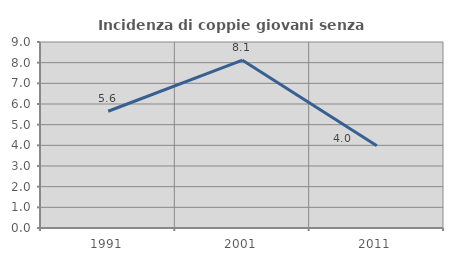
| Category | Incidenza di coppie giovani senza figli |
|---|---|
| 1991.0 | 5.65 |
| 2001.0 | 8.122 |
| 2011.0 | 3.981 |